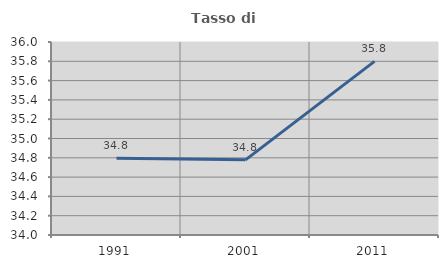
| Category | Tasso di occupazione   |
|---|---|
| 1991.0 | 34.794 |
| 2001.0 | 34.779 |
| 2011.0 | 35.8 |